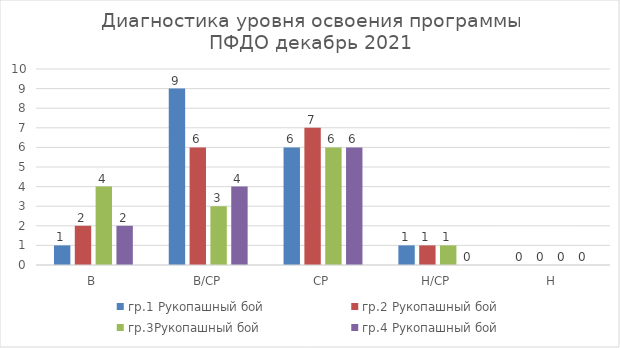
| Category | гр.1 Рукопашный бой | гр.2 Рукопашный бой | гр.3Рукопашный бой | гр.4 Рукопашный бой |
|---|---|---|---|---|
| В | 1 | 2 | 4 | 2 |
| В/СР | 9 | 6 | 3 | 4 |
| СР | 6 | 7 | 6 | 6 |
| Н/СР | 1 | 1 | 1 | 0 |
| Н | 0 | 0 | 0 | 0 |